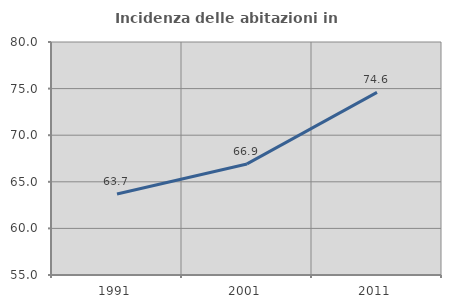
| Category | Incidenza delle abitazioni in proprietà  |
|---|---|
| 1991.0 | 63.688 |
| 2001.0 | 66.918 |
| 2011.0 | 74.602 |